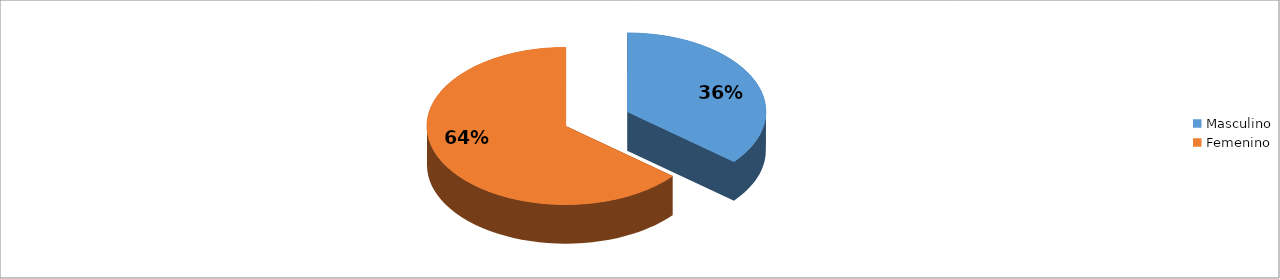
| Category | Series 0 |
|---|---|
| Masculino | 0.36 |
| Femenino | 0.64 |